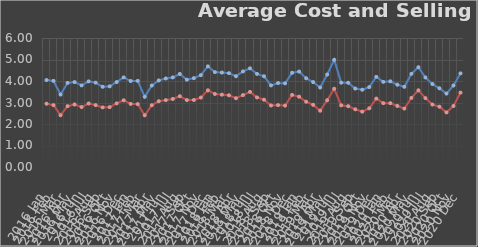
| Category | Avg Unit Cost | Avg Profit |
|---|---|---|
| 0 | 4.046 | 2.943 |
| 1 | 4.006 | 2.878 |
| 2 | 3.371 | 2.409 |
| 3 | 3.91 | 2.83 |
| 4 | 3.95 | 2.908 |
| 5 | 3.796 | 2.788 |
| 6 | 3.984 | 2.953 |
| 7 | 3.923 | 2.878 |
| 8 | 3.731 | 2.772 |
| 9 | 3.752 | 2.785 |
| 10 | 3.951 | 2.959 |
| 11 | 4.169 | 3.102 |
| 12 | 4 | 2.934 |
| 13 | 4.006 | 2.926 |
| 14 | 3.264 | 2.405 |
| 15 | 3.79 | 2.872 |
| 16 | 4.026 | 3.059 |
| 17 | 4.117 | 3.112 |
| 18 | 4.167 | 3.164 |
| 19 | 4.327 | 3.291 |
| 20 | 4.063 | 3.113 |
| 21 | 4.132 | 3.116 |
| 22 | 4.273 | 3.229 |
| 23 | 4.681 | 3.567 |
| 24 | 4.413 | 3.397 |
| 25 | 4.393 | 3.364 |
| 26 | 4.365 | 3.336 |
| 27 | 4.222 | 3.198 |
| 28 | 4.447 | 3.345 |
| 29 | 4.59 | 3.495 |
| 30 | 4.329 | 3.235 |
| 31 | 4.219 | 3.129 |
| 32 | 3.796 | 2.861 |
| 33 | 3.905 | 2.88 |
| 34 | 3.89 | 2.857 |
| 35 | 4.381 | 3.353 |
| 36 | 4.439 | 3.269 |
| 37 | 4.127 | 3.037 |
| 38 | 3.95 | 2.892 |
| 39 | 3.697 | 2.619 |
| 40 | 4.301 | 3.105 |
| 41 | 4.984 | 3.638 |
| 42 | 3.922 | 2.868 |
| 43 | 3.916 | 2.828 |
| 44 | 3.649 | 2.683 |
| 45 | 3.593 | 2.576 |
| 46 | 3.717 | 2.731 |
| 47 | 4.192 | 3.183 |
| 48 | 3.96 | 2.97 |
| 49 | 3.985 | 2.969 |
| 50 | 3.828 | 2.839 |
| 51 | 3.73 | 2.716 |
| 52 | 4.333 | 3.213 |
| 53 | 4.641 | 3.567 |
| 54 | 4.165 | 3.205 |
| 55 | 3.858 | 2.905 |
| 56 | 3.661 | 2.804 |
| 57 | 3.415 | 2.539 |
| 58 | 3.791 | 2.838 |
| 59 | 4.355 | 3.46 |